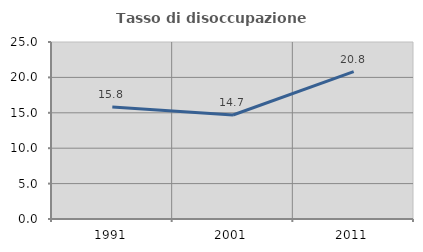
| Category | Tasso di disoccupazione giovanile  |
|---|---|
| 1991.0 | 15.814 |
| 2001.0 | 14.694 |
| 2011.0 | 20.809 |